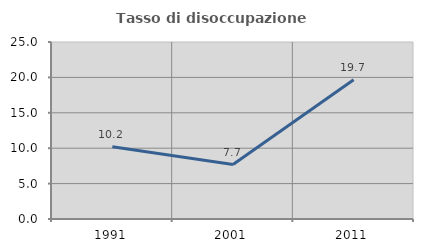
| Category | Tasso di disoccupazione giovanile  |
|---|---|
| 1991.0 | 10.22 |
| 2001.0 | 7.692 |
| 2011.0 | 19.681 |